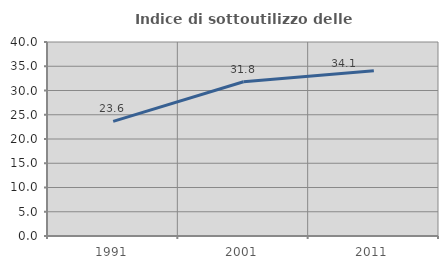
| Category | Indice di sottoutilizzo delle abitazioni  |
|---|---|
| 1991.0 | 23.642 |
| 2001.0 | 31.806 |
| 2011.0 | 34.075 |